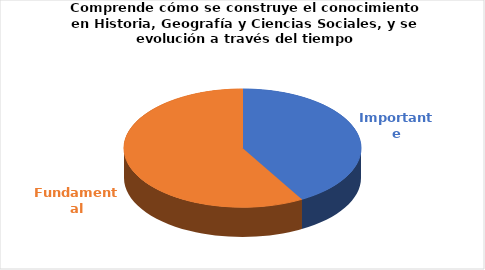
| Category | Series 0 |
|---|---|
| Importante | 5 |
| Fundamental | 7 |